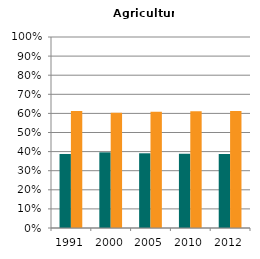
| Category | Male | Female |
|---|---|---|
| 1991.0 | 0.388 | 0.612 |
| 2000.0 | 0.396 | 0.604 |
| 2005.0 | 0.391 | 0.609 |
| 2010.0 | 0.389 | 0.611 |
| 2012.0 | 0.388 | 0.612 |